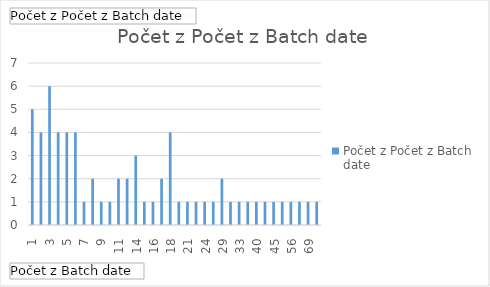
| Category | Celkem |
|---|---|
| 1 | 5 |
| 2 | 4 |
| 3 | 6 |
| 4 | 4 |
| 5 | 4 |
| 6 | 4 |
| 7 | 1 |
| 8 | 2 |
| 9 | 1 |
| 10 | 1 |
| 11 | 2 |
| 13 | 2 |
| 14 | 3 |
| 15 | 1 |
| 16 | 1 |
| 17 | 2 |
| 18 | 4 |
| 20 | 1 |
| 21 | 1 |
| 22 | 1 |
| 24 | 1 |
| 25 | 1 |
| 29 | 2 |
| 30 | 1 |
| 33 | 1 |
| 38 | 1 |
| 40 | 1 |
| 43 | 1 |
| 45 | 1 |
| 48 | 1 |
| 56 | 1 |
| 58 | 1 |
| 69 | 1 |
| 134 | 1 |